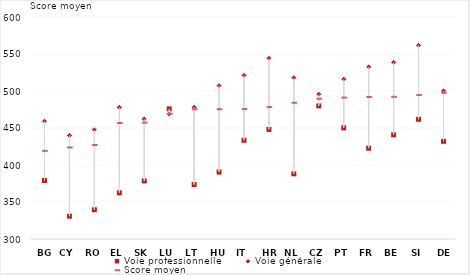
| Category | Voie professionnelle | Voie générale | Score moyen |
|---|---|---|---|
| BG | 379.06 | 459.204 | 419.844 |
| CY | 330.81 | 439.889 | 424.358 |
| RO | 339.455 | 447.496 | 427.703 |
| EL | 362.366 | 477.931 | 457.414 |
| SK | 378.426 | 462.156 | 457.984 |
| LU | 475.863 | 468.993 | 469.985 |
| LT | 373.476 | 478.013 | 475.873 |
| HU | 390.468 | 507.209 | 475.987 |
| IT | 433.47 | 521.051 | 476.285 |
| HR | 448.122 | 544.199 | 478.989 |
| NL | 388.035 | 517.98 | 484.784 |
| CZ | 479.886 | 495.508 | 490.219 |
| PT | 450.138 | 515.939 | 491.801 |
| FR | 422.709 | 532.538 | 492.606 |
| BE | 440.745 | 538.67 | 492.864 |
| SI | 461.803 | 561.739 | 495.346 |
| DE | 432.064 | 500.204 | 498.279 |